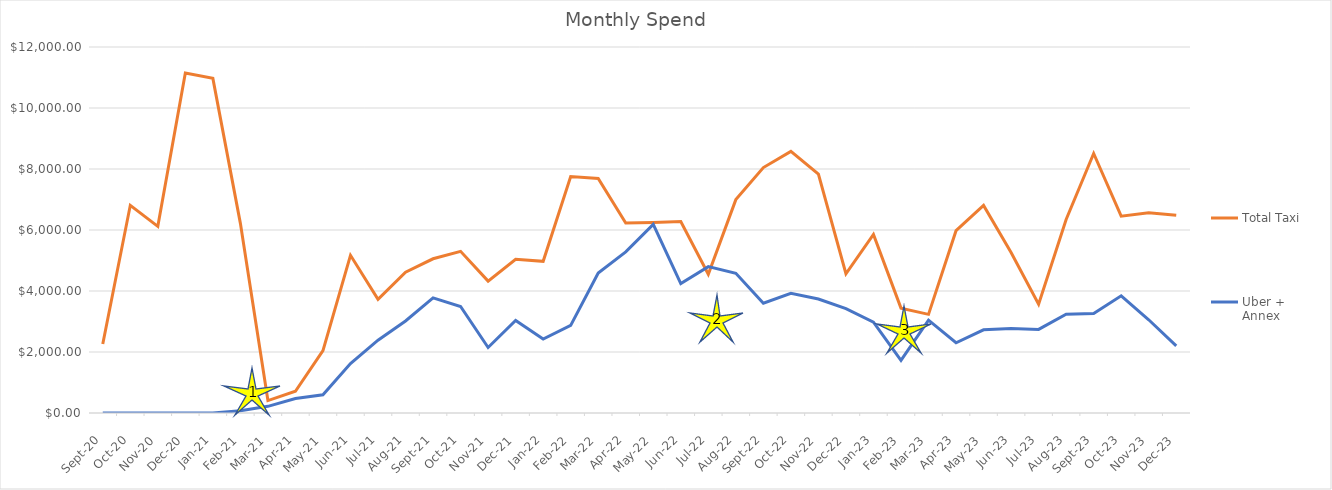
| Category | Total Taxi | Uber + Annex |
|---|---|---|
| 2020-09-01 | 2261.5 | 0 |
| 2020-10-01 | 6810.3 | 0 |
| 2020-11-01 | 6119.6 | 0 |
| 2020-12-01 | 11144.6 | 0 |
| 2021-01-01 | 10971.5 | 0 |
| 2021-02-01 | 6218 | 73.1 |
| 2021-03-01 | 406.5 | 218.64 |
| 2021-04-01 | 714 | 476.11 |
| 2021-05-01 | 2043 | 598.13 |
| 2021-06-01 | 5170.3 | 1618.72 |
| 2021-07-01 | 3724.5 | 2388.37 |
| 2021-08-01 | 4617.5 | 3017.75 |
| 2021-09-01 | 5056.5 | 3774.34 |
| 2021-10-01 | 5300.3 | 3492.27 |
| 2021-11-01 | 4323.3 | 2147.85 |
| 2021-12-01 | 5040 | 3032.66 |
| 2022-01-01 | 4973.9 | 2426.53 |
| 2022-02-01 | 7755.5 | 2872.53 |
| 2022-03-01 | 7691.3 | 4590.11 |
| 2022-04-01 | 6230.5 | 5282.77 |
| 2022-05-01 | 6246.1 | 6185.38 |
| 2022-06-01 | 6277 | 4243.07 |
| 2022-07-01 | 4549.4 | 4798.18 |
| 2022-08-01 | 6995.95 | 4578.69 |
| 2022-09-01 | 8047.45 | 3598.24 |
| 2022-10-01 | 8576 | 3921.32 |
| 2022-11-01 | 7833.65 | 3738.53 |
| 2022-12-01 | 4565.3 | 3419.72 |
| 2023-01-01 | 5856.35 | 2975.65 |
| 2023-02-01 | 3438 | 1724.79 |
| 2023-03-01 | 3234.3 | 3045.43 |
| 2023-04-01 | 5977.1 | 2303.51 |
| 2023-05-01 | 6804.05 | 2726.23 |
| 2023-06-01 | 5261.9 | 2766.79 |
| 2023-07-01 | 3569.1 | 2741.18 |
| 2023-08-01 | 6346.55 | 3235.79 |
| 2023-09-01 | 8508.95 | 3258.22 |
| 2023-10-01 | 6453.25 | 3843.71 |
| 2023-11-01 | 6564.5 | 3056.46 |
| 2023-12-01 | 6480.95 | 2203.66 |